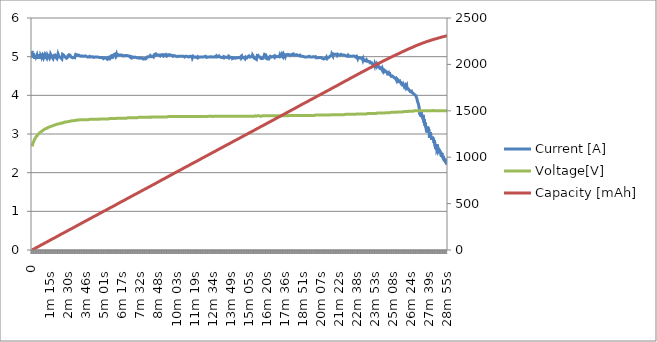
| Category | Current [A] | Voltage[V] |
|---|---|---|
| 0 | 5.15 | 2.68 |
|  1s  | 5.02 | 2.71 |
|  2s  | 5 | 2.75 |
|  4s  | 5.03 | 2.78 |
|  5s  | 5.04 | 2.8 |
|  7s  | 4.97 | 2.82 |
|  8s  | 5.02 | 2.85 |
|  10s  | 4.95 | 2.86 |
|  11s  | 5.02 | 2.88 |
|  13s  | 4.97 | 2.9 |
|  14s  | 5.04 | 2.91 |
|  16s  | 5 | 2.93 |
|  17s  | 4.98 | 2.94 |
|  19s  | 5.04 | 2.95 |
|  20s  | 4.98 | 2.96 |
|  22s  | 4.94 | 2.97 |
|  23s  | 5.05 | 2.99 |
|  25s  | 5.01 | 2.99 |
|  26s  | 4.98 | 3 |
|  28s  | 4.98 | 3.01 |
|  29s  | 5.06 | 3.02 |
|  31s  | 5.02 | 3.03 |
|  32s  | 4.98 | 3.04 |
|  34s  | 4.95 | 3.04 |
|  35s  | 5.04 | 3.05 |
|  36s  | 5.03 | 3.06 |
|  38s  | 5.01 | 3.07 |
|  39s  | 4.98 | 3.07 |
|  41s  | 4.97 | 3.08 |
|  42s  | 4.98 | 3.09 |
|  44s  | 5.05 | 3.09 |
|  45s  | 5.04 | 3.1 |
|  47s  | 5.02 | 3.1 |
|  48s  | 4.98 | 3.11 |
|  50s  | 4.97 | 3.11 |
|  51s  | 4.97 | 3.12 |
|  53s  | 5.05 | 3.13 |
|  54s  | 5.04 | 3.13 |
|  56s  | 5 | 3.14 |
|  57s  | 5.01 | 3.14 |
|  59s  | 4.98 | 3.14 |
|  1m 00s  | 4.96 | 3.15 |
|  1m 02s  | 4.94 | 3.15 |
|  1m 03s  | 5.05 | 3.16 |
|  1m 05s  | 5.05 | 3.16 |
|  1m 06s  | 5.02 | 3.17 |
|  1m 08s  | 5.01 | 3.17 |
|  1m 09s  | 4.99 | 3.17 |
|  1m 11s  | 4.97 | 3.18 |
|  1m 12s  | 4.96 | 3.18 |
|  1m 13s  | 4.94 | 3.19 |
|  1m 15s  | 5.01 | 3.19 |
|  1m 16s  | 5.06 | 3.19 |
|  1m 18s  | 5.04 | 3.2 |
|  1m 19s  | 5.02 | 3.2 |
|  1m 21s  | 5.02 | 3.2 |
|  1m 22s  | 4.99 | 3.21 |
|  1m 24s  | 4.98 | 3.21 |
|  1m 25s  | 4.97 | 3.21 |
|  1m 27s  | 4.95 | 3.22 |
|  1m 28s  | 4.93 | 3.22 |
|  1m 30s  | 5.03 | 3.23 |
|  1m 31s  | 5.05 | 3.23 |
|  1m 33s  | 5.04 | 3.23 |
|  1m 34s  | 5.04 | 3.23 |
|  1m 36s  | 5.01 | 3.24 |
|  1m 37s  | 5.01 | 3.24 |
|  1m 39s  | 4.98 | 3.24 |
|  1m 40s  | 4.97 | 3.24 |
|  1m 42s  | 4.97 | 3.25 |
|  1m 43s  | 4.95 | 3.25 |
|  1m 45s  | 4.93 | 3.25 |
|  1m 46s  | 5.03 | 3.26 |
|  1m 47s  | 5.07 | 3.26 |
|  1m 49s  | 5.05 | 3.26 |
|  1m 50s  | 5.02 | 3.26 |
|  1m 52s  | 5.03 | 3.26 |
|  1m 53s  | 5.02 | 3.27 |
|  1m 55s  | 4.99 | 3.27 |
|  1m 56s  | 5 | 3.27 |
|  1m 58s  | 4.98 | 3.27 |
|  1m 59s  | 4.97 | 3.28 |
|  2m 01s  | 4.96 | 3.28 |
|  2m 02s  | 4.96 | 3.28 |
|  2m 04s  | 4.94 | 3.28 |
|  2m 05s  | 4.99 | 3.29 |
|  2m 07s  | 5.06 | 3.29 |
|  2m 08s  | 5.04 | 3.29 |
|  2m 10s  | 5.04 | 3.29 |
|  2m 11s  | 5.04 | 3.3 |
|  2m 13s  | 5.03 | 3.3 |
|  2m 14s  | 5.01 | 3.3 |
|  2m 16s  | 5.01 | 3.3 |
|  2m 17s  | 5.01 | 3.31 |
|  2m 19s  | 4.99 | 3.31 |
|  2m 20s  | 4.97 | 3.31 |
|  2m 22s  | 4.99 | 3.31 |
|  2m 23s  | 4.96 | 3.31 |
|  2m 24s  | 4.95 | 3.31 |
|  2m 26s  | 4.95 | 3.32 |
|  2m 27s  | 4.98 | 3.32 |
|  2m 29s  | 5.02 | 3.32 |
|  2m 30s  | 5.04 | 3.32 |
|  2m 32s  | 5.04 | 3.32 |
|  2m 33s  | 5.05 | 3.33 |
|  2m 35s  | 5.05 | 3.33 |
|  2m 36s  | 5.03 | 3.33 |
|  2m 38s  | 5.04 | 3.33 |
|  2m 39s  | 5.02 | 3.33 |
|  2m 41s  | 5 | 3.33 |
|  2m 42s  | 5.01 | 3.34 |
|  2m 44s  | 5 | 3.34 |
|  2m 45s  | 4.98 | 3.34 |
|  2m 47s  | 4.98 | 3.34 |
|  2m 48s  | 4.99 | 3.34 |
|  2m 50s  | 4.97 | 3.34 |
|  2m 51s  | 4.96 | 3.34 |
|  2m 53s  | 4.95 | 3.34 |
|  2m 54s  | 4.98 | 3.35 |
|  2m 55s  | 4.94 | 3.35 |
|  2m 57s  | 4.97 | 3.35 |
|  2m 59s  | 4.99 | 3.35 |
|  3m 00s  | 4.99 | 3.35 |
|  3m 01s  | 5.06 | 3.35 |
|  3m 03s  | 5.05 | 3.36 |
|  3m 04s  | 5.05 | 3.36 |
|  3m 06s  | 5.05 | 3.36 |
|  3m 07s  | 5.05 | 3.36 |
|  3m 09s  | 5.06 | 3.36 |
|  3m 10s  | 5.03 | 3.36 |
|  3m 12s  | 5.04 | 3.36 |
|  3m 13s  | 5.04 | 3.36 |
|  3m 15s  | 5.04 | 3.36 |
|  3m 16s  | 5.04 | 3.36 |
|  3m 18s  | 5.04 | 3.37 |
|  3m 19s  | 5.02 | 3.37 |
|  3m 21s  | 5.03 | 3.37 |
|  3m 22s  | 5.03 | 3.37 |
|  3m 24s  | 5.01 | 3.37 |
|  3m 25s  | 5.02 | 3.37 |
|  3m 27s  | 5.03 | 3.37 |
|  3m 28s  | 5.02 | 3.37 |
|  3m 30s  | 5.03 | 3.37 |
|  3m 31s  | 5.02 | 3.37 |
|  3m 33s  | 5.01 | 3.37 |
|  3m 34s  | 5 | 3.37 |
|  3m 35s  | 5 | 3.37 |
|  3m 37s  | 5.01 | 3.37 |
|  3m 38s  | 5 | 3.37 |
|  3m 40s  | 5.02 | 3.37 |
|  3m 41s  | 5.02 | 3.37 |
|  3m 43s  | 5 | 3.37 |
|  3m 44s  | 5.02 | 3.37 |
|  3m 46s  | 5.01 | 3.37 |
|  3m 47s  | 5 | 3.37 |
|  3m 49s  | 4.99 | 3.37 |
|  3m 50s  | 4.99 | 3.37 |
|  3m 52s  | 4.99 | 3.37 |
|  3m 53s  | 4.99 | 3.38 |
|  3m 55s  | 4.99 | 3.37 |
|  3m 56s  | 4.99 | 3.38 |
|  3m 58s  | 5 | 3.38 |
|  3m 59s  | 5.01 | 3.38 |
|  4m 01s  | 5.01 | 3.38 |
|  4m 02s  | 5 | 3.38 |
|  4m 04s  | 4.99 | 3.38 |
|  4m 05s  | 4.99 | 3.38 |
|  4m 07s  | 4.99 | 3.38 |
|  4m 08s  | 5 | 3.38 |
|  4m 10s  | 5 | 3.38 |
|  4m 11s  | 5 | 3.38 |
|  4m 12s  | 5 | 3.38 |
|  4m 14s  | 4.99 | 3.38 |
|  4m 15s  | 5 | 3.38 |
|  4m 17s  | 4.98 | 3.38 |
|  4m 18s  | 4.98 | 3.38 |
|  4m 20s  | 4.99 | 3.38 |
|  4m 21s  | 4.99 | 3.38 |
|  4m 23s  | 4.99 | 3.38 |
|  4m 24s  | 4.98 | 3.38 |
|  4m 26s  | 4.99 | 3.38 |
|  4m 27s  | 4.99 | 3.38 |
|  4m 29s  | 4.98 | 3.38 |
|  4m 30s  | 4.99 | 3.38 |
|  4m 32s  | 5 | 3.38 |
|  4m 33s  | 5 | 3.38 |
|  4m 35s  | 4.99 | 3.38 |
|  4m 36s  | 4.98 | 3.38 |
|  4m 38s  | 4.99 | 3.38 |
|  4m 39s  | 4.98 | 3.38 |
|  4m 41s  | 4.98 | 3.39 |
|  4m 42s  | 4.98 | 3.39 |
|  4m 44s  | 4.98 | 3.39 |
|  4m 45s  | 4.97 | 3.39 |
|  4m 47s  | 4.97 | 3.39 |
|  4m 48s  | 4.98 | 3.39 |
|  4m 49s  | 4.98 | 3.39 |
|  4m 51s  | 4.96 | 3.39 |
|  4m 52s  | 4.98 | 3.39 |
|  4m 54s  | 4.98 | 3.39 |
|  4m 55s  | 4.98 | 3.39 |
|  4m 57s  | 4.95 | 3.39 |
|  4m 58s  | 4.97 | 3.39 |
|  5m 00s  | 4.96 | 3.39 |
|  5m 01s  | 4.97 | 3.39 |
|  5m 03s  | 4.96 | 3.39 |
|  5m 04s  | 4.96 | 3.39 |
|  5m 06s  | 4.97 | 3.39 |
|  5m 07s  | 4.96 | 3.39 |
|  5m 09s  | 4.97 | 3.39 |
|  5m 10s  | 4.95 | 3.39 |
|  5m 12s  | 4.97 | 3.39 |
|  5m 13s  | 4.96 | 3.39 |
|  5m 15s  | 4.97 | 3.39 |
|  5m 16s  | 4.94 | 3.39 |
|  5m 18s  | 4.96 | 3.39 |
|  5m 19s  | 4.94 | 3.39 |
|  5m 21s  | 4.96 | 3.39 |
|  5m 22s  | 4.94 | 3.4 |
|  5m 23s  | 4.95 | 3.4 |
|  5m 25s  | 4.99 | 3.4 |
|  5m 26s  | 4.96 | 3.4 |
|  5m 28s  | 4.98 | 3.4 |
|  5m 29s  | 4.95 | 3.4 |
|  5m 31s  | 4.99 | 3.4 |
|  5m 32s  | 4.95 | 3.4 |
|  5m 34s  | 4.99 | 3.4 |
|  5m 35s  | 5.01 | 3.4 |
|  5m 37s  | 5.06 | 3.4 |
|  5m 38s  | 5.02 | 3.4 |
|  5m 40s  | 5.01 | 3.4 |
|  5m 41s  | 5.04 | 3.4 |
|  5m 43s  | 5.06 | 3.4 |
|  5m 44s  | 5.07 | 3.4 |
|  5m 46s  | 5.06 | 3.4 |
|  5m 47s  | 5.07 | 3.4 |
|  5m 49s  | 5.03 | 3.4 |
|  5m 50s  | 5.05 | 3.4 |
|  5m 52s  | 5.07 | 3.41 |
|  5m 53s  | 5.03 | 3.4 |
|  5m 55s  | 5.05 | 3.41 |
|  5m 56s  | 5.06 | 3.41 |
|  5m 58s  | 5.06 | 3.41 |
|  5m 59s  | 5.05 | 3.41 |
|  6m 00s  | 5.04 | 3.41 |
|  6m 02s  | 5.05 | 3.41 |
|  6m 03s  | 5.05 | 3.41 |
|  6m 05s  | 5.04 | 3.41 |
|  6m 06s  | 5.04 | 3.41 |
|  6m 08s  | 5.04 | 3.41 |
|  6m 09s  | 5.04 | 3.41 |
|  6m 11s  | 5.03 | 3.41 |
|  6m 12s  | 5.03 | 3.41 |
|  6m 14s  | 5.04 | 3.41 |
|  6m 15s  | 5.05 | 3.41 |
|  6m 17s  | 5.04 | 3.41 |
|  6m 18s  | 5.02 | 3.41 |
|  6m 20s  | 5.03 | 3.41 |
|  6m 21s  | 5.02 | 3.41 |
|  6m 23s  | 5.03 | 3.41 |
|  6m 24s  | 5.03 | 3.41 |
|  6m 26s  | 5.03 | 3.41 |
|  6m 27s  | 5.02 | 3.41 |
|  6m 29s  | 5.02 | 3.41 |
|  6m 30s  | 5.01 | 3.41 |
|  6m 32s  | 5.03 | 3.41 |
|  6m 33s  | 5.04 | 3.41 |
|  6m 34s  | 5.02 | 3.41 |
|  6m 36s  | 5.03 | 3.42 |
|  6m 37s  | 5.01 | 3.42 |
|  6m 39s  | 5.01 | 3.42 |
|  6m 40s  | 5.02 | 3.42 |
|  6m 42s  | 5.03 | 3.42 |
|  6m 43s  | 5.01 | 3.42 |
|  6m 45s  | 5.02 | 3.42 |
|  6m 46s  | 5.01 | 3.42 |
|  6m 48s  | 5 | 3.42 |
|  6m 49s  | 4.99 | 3.42 |
|  6m 51s  | 4.99 | 3.42 |
|  6m 52s  | 4.99 | 3.42 |
|  6m 54s  | 4.97 | 3.42 |
|  6m 55s  | 5 | 3.42 |
|  6m 57s  | 4.99 | 3.42 |
|  6m 58s  | 4.99 | 3.42 |
|  7m 00s  | 4.99 | 3.42 |
|  7m 01s  | 4.98 | 3.42 |
|  7m 03s  | 5 | 3.42 |
|  7m 04s  | 4.98 | 3.42 |
|  7m 06s  | 4.98 | 3.42 |
|  7m 07s  | 4.99 | 3.42 |
|  7m 08s  | 4.99 | 3.42 |
|  7m 10s  | 4.98 | 3.42 |
|  7m 11s  | 4.98 | 3.42 |
|  7m 13s  | 4.98 | 3.42 |
|  7m 14s  | 4.99 | 3.42 |
|  7m 16s  | 4.97 | 3.42 |
|  7m 17s  | 4.97 | 3.42 |
|  7m 19s  | 4.96 | 3.42 |
|  7m 20s  | 4.97 | 3.42 |
|  7m 22s  | 4.97 | 3.42 |
|  7m 23s  | 4.98 | 3.43 |
|  7m 25s  | 4.97 | 3.42 |
|  7m 26s  | 4.96 | 3.43 |
|  7m 28s  | 4.96 | 3.43 |
|  7m 29s  | 4.96 | 3.43 |
|  7m 31s  | 4.97 | 3.43 |
|  7m 32s  | 4.95 | 3.43 |
|  7m 34s  | 4.97 | 3.43 |
|  7m 35s  | 4.96 | 3.43 |
|  7m 37s  | 4.97 | 3.43 |
|  7m 38s  | 4.97 | 3.43 |
|  7m 40s  | 4.96 | 3.43 |
|  7m 41s  | 4.96 | 3.43 |
|  7m 43s  | 4.97 | 3.43 |
|  7m 44s  | 4.94 | 3.43 |
|  7m 46s  | 4.94 | 3.43 |
|  7m 47s  | 4.95 | 3.43 |
|  7m 48s  | 4.95 | 3.43 |
|  7m 50s  | 4.96 | 3.43 |
|  7m 51s  | 4.93 | 3.43 |
|  7m 53s  | 4.94 | 3.43 |
|  7m 54s  | 4.94 | 3.43 |
|  7m 56s  | 4.96 | 3.43 |
|  7m 57s  | 4.96 | 3.43 |
|  7m 59s  | 4.95 | 3.43 |
|  8m 00s  | 4.99 | 3.43 |
|  8m 02s  | 5 | 3.43 |
|  8m 03s  | 5.01 | 3.43 |
|  8m 05s  | 5 | 3.43 |
|  8m 06s  | 5.01 | 3.43 |
|  8m 08s  | 5 | 3.43 |
|  8m 09s  | 5 | 3.43 |
|  8m 11s  | 5 | 3.43 |
|  8m 12s  | 4.99 | 3.44 |
|  8m 14s  | 5.03 | 3.43 |
|  8m 15s  | 5.02 | 3.43 |
|  8m 17s  | 5.02 | 3.43 |
|  8m 18s  | 5 | 3.44 |
|  8m 20s  | 5.01 | 3.44 |
|  8m 21s  | 5 | 3.44 |
|  8m 22s  | 5.01 | 3.44 |
|  8m 24s  | 5 | 3.44 |
|  8m 25s  | 5.01 | 3.44 |
|  8m 27s  | 4.99 | 3.44 |
|  8m 28s  | 5.01 | 3.44 |
|  8m 30s  | 5.03 | 3.44 |
|  8m 31s  | 5.06 | 3.44 |
|  8m 33s  | 5.04 | 3.44 |
|  8m 34s  | 5.06 | 3.44 |
|  8m 36s  | 5.07 | 3.44 |
|  8m 37s  | 5.04 | 3.44 |
|  8m 39s  | 5.05 | 3.44 |
|  8m 40s  | 5.04 | 3.44 |
|  8m 42s  | 5.05 | 3.44 |
|  8m 43s  | 5.06 | 3.44 |
|  8m 45s  | 5.06 | 3.44 |
|  8m 46s  | 5.04 | 3.44 |
|  8m 48s  | 5.05 | 3.44 |
|  8m 49s  | 5.05 | 3.44 |
|  8m 51s  | 5.04 | 3.44 |
|  8m 52s  | 5.05 | 3.44 |
|  8m 54s  | 5.05 | 3.44 |
|  8m 55s  | 5.02 | 3.44 |
|  8m 57s  | 5.04 | 3.44 |
|  8m 58s  | 5.03 | 3.44 |
|  8m 59s  | 5.05 | 3.44 |
|  9m 01s  | 5.04 | 3.44 |
|  9m 02s  | 5.05 | 3.44 |
|  9m 04s  | 5.05 | 3.44 |
|  9m 05s  | 5.03 | 3.44 |
|  9m 07s  | 5.04 | 3.44 |
|  9m 08s  | 5.02 | 3.44 |
|  9m 10s  | 5.03 | 3.44 |
|  9m 11s  | 5.05 | 3.44 |
|  9m 13s  | 5.05 | 3.44 |
|  9m 14s  | 5.04 | 3.44 |
|  9m 16s  | 5.04 | 3.44 |
|  9m 17s  | 5.05 | 3.44 |
|  9m 19s  | 5.05 | 3.44 |
|  9m 20s  | 5.02 | 3.44 |
|  9m 22s  | 5.05 | 3.45 |
|  9m 23s  | 5.03 | 3.44 |
|  9m 25s  | 5.04 | 3.44 |
|  9m 26s  | 5.03 | 3.45 |
|  9m 28s  | 5.04 | 3.45 |
|  9m 29s  | 5.03 | 3.45 |
|  9m 31s  | 5.05 | 3.45 |
|  9m 32s  | 5.04 | 3.45 |
|  9m 34s  | 5.05 | 3.45 |
|  9m 35s  | 5.05 | 3.45 |
|  9m 36s  | 5.05 | 3.45 |
|  9m 38s  | 5.04 | 3.45 |
|  9m 39s  | 5.04 | 3.45 |
|  9m 41s  | 5.03 | 3.45 |
|  9m 42s  | 5.02 | 3.45 |
|  9m 44s  | 5.03 | 3.45 |
|  9m 45s  | 5.02 | 3.45 |
|  9m 47s  | 5.03 | 3.45 |
|  9m 48s  | 5.01 | 3.45 |
|  9m 50s  | 5.02 | 3.45 |
|  9m 51s  | 5.02 | 3.45 |
|  9m 53s  | 5.03 | 3.45 |
|  9m 54s  | 5.02 | 3.45 |
|  9m 56s  | 5.01 | 3.45 |
|  9m 57s  | 5.02 | 3.45 |
|  9m 59s  | 5 | 3.45 |
|  10m 00s  | 5 | 3.45 |
|  10m 02s  | 5.01 | 3.45 |
|  10m 03s  | 5.01 | 3.45 |
|  10m 05s  | 5.02 | 3.45 |
|  10m 06s  | 5 | 3.45 |
|  10m 08s  | 4.99 | 3.45 |
|  10m 09s  | 5 | 3.45 |
|  10m 10s  | 5.01 | 3.45 |
|  10m 12s  | 5 | 3.45 |
|  10m 13s  | 5 | 3.45 |
|  10m 15s  | 5.01 | 3.45 |
|  10m 16s  | 5.02 | 3.45 |
|  10m 18s  | 5 | 3.45 |
|  10m 19s  | 5.01 | 3.45 |
|  10m 21s  | 5.01 | 3.45 |
|  10m 22s  | 4.99 | 3.45 |
|  10m 24s  | 5.01 | 3.45 |
|  10m 25s  | 5.01 | 3.45 |
|  10m 27s  | 5.02 | 3.45 |
|  10m 28s  | 5.01 | 3.45 |
|  10m 30s  | 5 | 3.45 |
|  10m 31s  | 5.01 | 3.45 |
|  10m 33s  | 5.01 | 3.45 |
|  10m 34s  | 5 | 3.45 |
|  10m 36s  | 5.01 | 3.45 |
|  10m 37s  | 4.99 | 3.45 |
|  10m 39s  | 4.99 | 3.45 |
|  10m 40s  | 5.01 | 3.45 |
|  10m 42s  | 5.01 | 3.45 |
|  10m 43s  | 5.01 | 3.45 |
|  10m 45s  | 5.01 | 3.45 |
|  10m 46s  | 5.01 | 3.45 |
|  10m 47s  | 4.99 | 3.45 |
|  10m 49s  | 5 | 3.45 |
|  10m 50s  | 5 | 3.45 |
|  10m 52s  | 4.99 | 3.45 |
|  10m 53s  | 5 | 3.45 |
|  10m 55s  | 4.99 | 3.45 |
|  10m 56s  | 5.01 | 3.45 |
|  10m 58s  | 5 | 3.45 |
|  10m 59s  | 5.01 | 3.45 |
|  11m 01s  | 5 | 3.45 |
|  11m 02s  | 5 | 3.45 |
|  11m 04s  | 5 | 3.45 |
|  11m 05s  | 5.01 | 3.45 |
|  11m 07s  | 5.02 | 3.45 |
|  11m 08s  | 5.01 | 3.45 |
|  11m 10s  | 4.97 | 3.45 |
|  11m 11s  | 4.98 | 3.45 |
|  11m 13s  | 5.01 | 3.45 |
|  11m 14s  | 5 | 3.45 |
|  11m 16s  | 5 | 3.45 |
|  11m 17s  | 4.99 | 3.45 |
|  11m 19s  | 4.99 | 3.45 |
|  11m 20s  | 5 | 3.45 |
|  11m 22s  | 4.99 | 3.45 |
|  11m 23s  | 4.99 | 3.45 |
|  11m 24s  | 4.97 | 3.45 |
|  11m 26s  | 4.98 | 3.45 |
|  11m 27s  | 4.99 | 3.45 |
|  11m 29s  | 4.99 | 3.45 |
|  11m 30s  | 5 | 3.45 |
|  11m 32s  | 4.98 | 3.45 |
|  11m 33s  | 4.97 | 3.45 |
|  11m 35s  | 4.99 | 3.45 |
|  11m 36s  | 4.99 | 3.45 |
|  11m 38s  | 4.99 | 3.45 |
|  11m 39s  | 4.99 | 3.45 |
|  11m 41s  | 4.98 | 3.45 |
|  11m 42s  | 4.99 | 3.45 |
|  11m 44s  | 5 | 3.45 |
|  11m 45s  | 4.98 | 3.45 |
|  11m 47s  | 4.99 | 3.45 |
|  11m 48s  | 4.98 | 3.45 |
|  11m 50s  | 4.99 | 3.45 |
|  11m 51s  | 4.99 | 3.45 |
|  11m 52s  | 4.99 | 3.45 |
|  11m 54s  | 4.99 | 3.45 |
|  11m 55s  | 4.99 | 3.45 |
|  11m 57s  | 4.98 | 3.45 |
|  11m 58s  | 4.98 | 3.45 |
|  12m 00s  | 5 | 3.45 |
|  12m 01s  | 4.99 | 3.45 |
|  12m 03s  | 5 | 3.45 |
|  12m 04s  | 5.01 | 3.45 |
|  12m 06s  | 5.01 | 3.45 |
|  12m 07s  | 5 | 3.45 |
|  12m 09s  | 4.98 | 3.45 |
|  12m 10s  | 5 | 3.45 |
|  12m 12s  | 4.99 | 3.45 |
|  12m 13s  | 4.99 | 3.46 |
|  12m 15s  | 4.99 | 3.45 |
|  12m 16s  | 5 | 3.46 |
|  12m 18s  | 4.99 | 3.45 |
|  12m 19s  | 5.01 | 3.45 |
|  12m 21s  | 5 | 3.46 |
|  12m 22s  | 4.99 | 3.45 |
|  12m 24s  | 5 | 3.45 |
|  12m 25s  | 5 | 3.46 |
|  12m 27s  | 5 | 3.45 |
|  12m 28s  | 5.01 | 3.46 |
|  12m 30s  | 4.99 | 3.46 |
|  12m 31s  | 4.99 | 3.46 |
|  12m 33s  | 4.98 | 3.46 |
|  12m 34s  | 4.99 | 3.45 |
|  12m 35s  | 4.99 | 3.46 |
|  12m 37s  | 5 | 3.46 |
|  12m 38s  | 4.99 | 3.46 |
|  12m 40s  | 4.99 | 3.46 |
|  12m 41s  | 4.99 | 3.46 |
|  12m 43s  | 5 | 3.46 |
|  12m 44s  | 5 | 3.46 |
|  12m 46s  | 5.01 | 3.46 |
|  12m 47s  | 5.01 | 3.46 |
|  12m 49s  | 5.02 | 3.46 |
|  12m 50s  | 4.99 | 3.46 |
|  12m 52s  | 5 | 3.46 |
|  12m 53s  | 4.98 | 3.46 |
|  12m 55s  | 4.99 | 3.46 |
|  12m 56s  | 5.01 | 3.46 |
|  12m 58s  | 5 | 3.46 |
|  12m 59s  | 5.01 | 3.46 |
|  13m 01s  | 4.97 | 3.46 |
|  13m 02s  | 5 | 3.46 |
|  13m 04s  | 5 | 3.46 |
|  13m 05s  | 4.98 | 3.46 |
|  13m 06s  | 4.99 | 3.46 |
|  13m 08s  | 4.98 | 3.46 |
|  13m 10s  | 4.97 | 3.46 |
|  13m 11s  | 4.98 | 3.46 |
|  13m 12s  | 4.98 | 3.46 |
|  13m 14s  | 4.96 | 3.46 |
|  13m 15s  | 4.98 | 3.46 |
|  13m 17s  | 4.97 | 3.46 |
|  13m 18s  | 5 | 3.46 |
|  13m 20s  | 5 | 3.46 |
|  13m 21s  | 4.98 | 3.46 |
|  13m 23s  | 4.97 | 3.46 |
|  13m 24s  | 4.97 | 3.46 |
|  13m 26s  | 4.96 | 3.46 |
|  13m 27s  | 4.99 | 3.46 |
|  13m 29s  | 4.99 | 3.46 |
|  13m 30s  | 4.97 | 3.46 |
|  13m 32s  | 4.98 | 3.46 |
|  13m 33s  | 5 | 3.46 |
|  13m 35s  | 5 | 3.46 |
|  13m 36s  | 4.99 | 3.46 |
|  13m 38s  | 4.99 | 3.46 |
|  13m 39s  | 5.01 | 3.46 |
|  13m 41s  | 4.97 | 3.46 |
|  13m 42s  | 5.01 | 3.46 |
|  13m 44s  | 5 | 3.46 |
|  13m 45s  | 5.01 | 3.46 |
|  13m 46s  | 4.99 | 3.46 |
|  13m 48s  | 4.97 | 3.46 |
|  13m 49s  | 4.99 | 3.46 |
|  13m 51s  | 4.98 | 3.46 |
|  13m 52s  | 4.97 | 3.46 |
|  13m 54s  | 4.98 | 3.46 |
|  13m 55s  | 4.98 | 3.46 |
|  13m 57s  | 4.95 | 3.46 |
|  13m 58s  | 4.96 | 3.46 |
|  14m 00s  | 4.97 | 3.46 |
|  14m 01s  | 4.96 | 3.46 |
|  14m 03s  | 4.95 | 3.46 |
|  14m 04s  | 4.97 | 3.46 |
|  14m 06s  | 4.97 | 3.46 |
|  14m 07s  | 4.96 | 3.46 |
|  14m 09s  | 4.96 | 3.46 |
|  14m 10s  | 4.96 | 3.46 |
|  14m 12s  | 4.95 | 3.46 |
|  14m 13s  | 4.95 | 3.46 |
|  14m 15s  | 4.97 | 3.46 |
|  14m 16s  | 4.97 | 3.46 |
|  14m 18s  | 4.98 | 3.46 |
|  14m 19s  | 4.97 | 3.46 |
|  14m 21s  | 4.98 | 3.46 |
|  14m 22s  | 4.98 | 3.46 |
|  14m 23s  | 4.98 | 3.46 |
|  14m 25s  | 4.96 | 3.46 |
|  14m 26s  | 4.97 | 3.46 |
|  14m 28s  | 4.97 | 3.46 |
|  14m 29s  | 4.97 | 3.46 |
|  14m 31s  | 4.98 | 3.46 |
|  14m 32s  | 5 | 3.46 |
|  14m 34s  | 4.97 | 3.46 |
|  14m 35s  | 4.98 | 3.46 |
|  14m 37s  | 5 | 3.46 |
|  14m 38s  | 4.97 | 3.46 |
|  14m 40s  | 4.95 | 3.46 |
|  14m 41s  | 4.95 | 3.46 |
|  14m 43s  | 4.97 | 3.46 |
|  14m 44s  | 4.97 | 3.46 |
|  14m 46s  | 4.99 | 3.46 |
|  14m 47s  | 4.98 | 3.46 |
|  14m 49s  | 4.96 | 3.46 |
|  14m 50s  | 4.95 | 3.46 |
|  14m 52s  | 4.96 | 3.46 |
|  14m 53s  | 4.99 | 3.46 |
|  14m 55s  | 4.99 | 3.46 |
|  14m 56s  | 4.98 | 3.46 |
|  14m 57s  | 4.97 | 3.46 |
|  14m 59s  | 4.98 | 3.46 |
|  15m 00s  | 4.96 | 3.46 |
|  15m 02s  | 5 | 3.46 |
|  15m 03s  | 5 | 3.46 |
|  15m 05s  | 5 | 3.46 |
|  15m 06s  | 5.02 | 3.46 |
|  15m 08s  | 5 | 3.46 |
|  15m 09s  | 5 | 3.46 |
|  15m 11s  | 4.99 | 3.46 |
|  15m 12s  | 5.01 | 3.46 |
|  15m 14s  | 4.99 | 3.46 |
|  15m 15s  | 5 | 3.46 |
|  15m 17s  | 5.01 | 3.46 |
|  15m 18s  | 5 | 3.46 |
|  15m 20s  | 5 | 3.46 |
|  15m 21s  | 5.04 | 3.46 |
|  15m 23s  | 5.02 | 3.46 |
|  15m 24s  | 5.01 | 3.46 |
|  15m 26s  | 5.02 | 3.46 |
|  15m 27s  | 4.99 | 3.46 |
|  15m 29s  | 4.96 | 3.46 |
|  15m 30s  | 4.97 | 3.46 |
|  15m 32s  | 4.95 | 3.47 |
|  15m 33s  | 4.95 | 3.46 |
|  15m 34s  | 4.94 | 3.46 |
|  15m 36s  | 4.93 | 3.46 |
|  15m 37s  | 4.93 | 3.46 |
|  15m 39s  | 4.95 | 3.46 |
|  15m 40s  | 5.01 | 3.47 |
|  15m 42s  | 5.07 | 3.46 |
|  15m 43s  | 5.02 | 3.46 |
|  15m 45s  | 5.01 | 3.47 |
|  15m 46s  | 5 | 3.47 |
|  15m 48s  | 5 | 3.47 |
|  15m 49s  | 5.01 | 3.47 |
|  15m 51s  | 5 | 3.47 |
|  15m 52s  | 4.99 | 3.47 |
|  15m 54s  | 4.97 | 3.46 |
|  15m 55s  | 4.97 | 3.46 |
|  15m 57s  | 4.95 | 3.47 |
|  15m 58s  | 4.97 | 3.46 |
|  16m 00s  | 4.95 | 3.47 |
|  16m 01s  | 4.95 | 3.47 |
|  16m 03s  | 4.95 | 3.47 |
|  16m 04s  | 4.96 | 3.47 |
|  16m 06s  | 4.96 | 3.47 |
|  16m 07s  | 5.02 | 3.47 |
|  16m 09s  | 4.96 | 3.47 |
|  16m 10s  | 4.94 | 3.47 |
|  16m 11s  | 5.06 | 3.47 |
|  16m 13s  | 5.06 | 3.47 |
|  16m 14s  | 5.04 | 3.47 |
|  16m 16s  | 5.05 | 3.47 |
|  16m 17s  | 5.04 | 3.47 |
|  16m 19s  | 5.01 | 3.46 |
|  16m 20s  | 4.95 | 3.47 |
|  16m 22s  | 4.95 | 3.47 |
|  16m 23s  | 4.94 | 3.47 |
|  16m 25s  | 4.94 | 3.47 |
|  16m 26s  | 4.94 | 3.47 |
|  16m 28s  | 4.93 | 3.47 |
|  16m 29s  | 4.94 | 3.47 |
|  16m 31s  | 4.98 | 3.47 |
|  16m 32s  | 5 | 3.47 |
|  16m 34s  | 5 | 3.47 |
|  16m 35s  | 5.01 | 3.47 |
|  16m 37s  | 5.01 | 3.47 |
|  16m 38s  | 5.01 | 3.47 |
|  16m 40s  | 4.99 | 3.47 |
|  16m 41s  | 5 | 3.47 |
|  16m 43s  | 5 | 3.47 |
|  16m 44s  | 5 | 3.47 |
|  16m 45s  | 4.99 | 3.47 |
|  16m 47s  | 5.01 | 3.47 |
|  16m 48s  | 5.01 | 3.47 |
|  16m 50s  | 4.99 | 3.47 |
|  16m 51s  | 5 | 3.47 |
|  16m 53s  | 4.98 | 3.47 |
|  16m 54s  | 5 | 3.47 |
|  16m 56s  | 5.02 | 3.47 |
|  16m 57s  | 5.01 | 3.47 |
|  16m 59s  | 5.02 | 3.47 |
|  17m 00s  | 5 | 3.47 |
|  17m 02s  | 5 | 3.47 |
|  17m 03s  | 4.99 | 3.47 |
|  17m 05s  | 5 | 3.47 |
|  17m 06s  | 4.99 | 3.47 |
|  17m 08s  | 5 | 3.47 |
|  17m 09s  | 5.01 | 3.47 |
|  17m 11s  | 4.99 | 3.47 |
|  17m 12s  | 5 | 3.47 |
|  17m 14s  | 5 | 3.47 |
|  17m 15s  | 5.03 | 3.47 |
|  17m 17s  | 5 | 3.47 |
|  17m 18s  | 5 | 3.47 |
|  17m 20s  | 5 | 3.47 |
|  17m 21s  | 5.01 | 3.47 |
|  17m 22s  | 4.99 | 3.47 |
|  17m 24s  | 5.06 | 3.47 |
|  17m 25s  | 5.05 | 3.47 |
|  17m 27s  | 5.02 | 3.47 |
|  17m 28s  | 5.04 | 3.47 |
|  17m 30s  | 5.06 | 3.47 |
|  17m 31s  | 5.03 | 3.47 |
|  17m 33s  | 5.06 | 3.47 |
|  17m 34s  | 5.06 | 3.47 |
|  17m 36s  | 5.06 | 3.47 |
|  17m 37s  | 5.05 | 3.47 |
|  17m 39s  | 5.02 | 3.47 |
|  17m 40s  | 5.05 | 3.47 |
|  17m 42s  | 5.05 | 3.47 |
|  17m 43s  | 5.04 | 3.47 |
|  17m 45s  | 5.05 | 3.48 |
|  17m 46s  | 5.06 | 3.47 |
|  17m 48s  | 5.07 | 3.48 |
|  17m 49s  | 5.06 | 3.47 |
|  17m 51s  | 5.05 | 3.48 |
|  17m 52s  | 5.06 | 3.48 |
|  17m 53s  | 5.05 | 3.48 |
|  17m 55s  | 5.06 | 3.48 |
|  17m 56s  | 5.05 | 3.48 |
|  17m 58s  | 5.03 | 3.48 |
|  17m 59s  | 5.03 | 3.48 |
|  18m 01s  | 5.04 | 3.48 |
|  18m 02s  | 5.05 | 3.48 |
|  18m 04s  | 5.05 | 3.48 |
|  18m 05s  | 5.03 | 3.48 |
|  18m 07s  | 5.06 | 3.48 |
|  18m 08s  | 5.05 | 3.48 |
|  18m 10s  | 5.06 | 3.48 |
|  18m 11s  | 5.07 | 3.48 |
|  18m 13s  | 5.04 | 3.48 |
|  18m 14s  | 5.06 | 3.48 |
|  18m 16s  | 5.03 | 3.48 |
|  18m 17s  | 5.05 | 3.48 |
|  18m 19s  | 5.04 | 3.48 |
|  18m 20s  | 5.03 | 3.48 |
|  18m 22s  | 5.04 | 3.48 |
|  18m 23s  | 5.04 | 3.48 |
|  18m 25s  | 5.03 | 3.48 |
|  18m 26s  | 5.05 | 3.48 |
|  18m 28s  | 5.04 | 3.48 |
|  18m 29s  | 5.04 | 3.48 |
|  18m 31s  | 5.03 | 3.48 |
|  18m 32s  | 5.05 | 3.48 |
|  18m 33s  | 5.02 | 3.48 |
|  18m 35s  | 5.03 | 3.48 |
|  18m 36s  | 5.03 | 3.48 |
|  18m 38s  | 5.03 | 3.48 |
|  18m 39s  | 5.04 | 3.48 |
|  18m 41s  | 5.04 | 3.48 |
|  18m 42s  | 5.01 | 3.48 |
|  18m 44s  | 5 | 3.48 |
|  18m 45s  | 5.01 | 3.48 |
|  18m 47s  | 5.01 | 3.48 |
|  18m 48s  | 5.03 | 3.48 |
|  18m 50s  | 5 | 3.48 |
|  18m 51s  | 5.01 | 3.48 |
|  18m 53s  | 4.99 | 3.48 |
|  18m 54s  | 5 | 3.48 |
|  18m 56s  | 5 | 3.48 |
|  18m 57s  | 5.02 | 3.48 |
|  18m 59s  | 5.01 | 3.48 |
|  19m 00s  | 4.99 | 3.48 |
|  19m 02s  | 5 | 3.48 |
|  19m 03s  | 4.99 | 3.48 |
|  19m 05s  | 4.99 | 3.48 |
|  19m 06s  | 5.01 | 3.48 |
|  19m 08s  | 5 | 3.48 |
|  19m 09s  | 4.99 | 3.48 |
|  19m 10s  | 4.99 | 3.48 |
|  19m 12s  | 4.99 | 3.48 |
|  19m 13s  | 5 | 3.48 |
|  19m 15s  | 5.02 | 3.48 |
|  19m 16s  | 4.99 | 3.48 |
|  19m 18s  | 5.01 | 3.48 |
|  19m 19s  | 4.99 | 3.48 |
|  19m 21s  | 5 | 3.48 |
|  19m 22s  | 4.99 | 3.48 |
|  19m 24s  | 5 | 3.48 |
|  19m 25s  | 5 | 3.48 |
|  19m 27s  | 4.99 | 3.48 |
|  19m 28s  | 4.99 | 3.48 |
|  19m 30s  | 5.01 | 3.48 |
|  19m 31s  | 4.99 | 3.48 |
|  19m 33s  | 4.99 | 3.48 |
|  19m 34s  | 4.99 | 3.49 |
|  19m 36s  | 5 | 3.48 |
|  19m 37s  | 5 | 3.48 |
|  19m 39s  | 4.99 | 3.48 |
|  19m 40s  | 4.99 | 3.48 |
|  19m 42s  | 4.99 | 3.49 |
|  19m 43s  | 4.97 | 3.49 |
|  19m 44s  | 5 | 3.49 |
|  19m 46s  | 4.98 | 3.49 |
|  19m 47s  | 4.97 | 3.49 |
|  19m 49s  | 4.98 | 3.49 |
|  19m 50s  | 4.98 | 3.49 |
|  19m 52s  | 4.97 | 3.49 |
|  19m 53s  | 4.99 | 3.49 |
|  19m 55s  | 4.99 | 3.49 |
|  19m 56s  | 4.97 | 3.49 |
|  19m 58s  | 4.97 | 3.49 |
|  19m 59s  | 4.97 | 3.49 |
|  20m 01s  | 4.98 | 3.49 |
|  20m 02s  | 5 | 3.49 |
|  20m 04s  | 4.97 | 3.49 |
|  20m 05s  | 4.98 | 3.49 |
|  20m 07s  | 5 | 3.49 |
|  20m 08s  | 4.96 | 3.49 |
|  20m 10s  | 4.97 | 3.49 |
|  20m 11s  | 4.97 | 3.49 |
|  20m 13s  | 4.96 | 3.49 |
|  20m 14s  | 4.95 | 3.49 |
|  20m 16s  | 4.96 | 3.49 |
|  20m 17s  | 4.93 | 3.49 |
|  20m 19s  | 4.94 | 3.49 |
|  20m 20s  | 4.96 | 3.49 |
|  20m 21s  | 4.95 | 3.49 |
|  20m 23s  | 4.95 | 3.49 |
|  20m 24s  | 4.96 | 3.49 |
|  20m 26s  | 4.95 | 3.49 |
|  20m 27s  | 4.96 | 3.49 |
|  20m 29s  | 4.97 | 3.49 |
|  20m 30s  | 4.99 | 3.49 |
|  20m 32s  | 5 | 3.49 |
|  20m 33s  | 4.95 | 3.49 |
|  20m 35s  | 4.93 | 3.49 |
|  20m 36s  | 4.95 | 3.49 |
|  20m 38s  | 4.98 | 3.49 |
|  20m 39s  | 5 | 3.49 |
|  20m 41s  | 5 | 3.49 |
|  20m 42s  | 4.99 | 3.49 |
|  20m 44s  | 5 | 3.49 |
|  20m 45s  | 5.01 | 3.49 |
|  20m 47s  | 5.02 | 3.49 |
|  20m 48s  | 5.03 | 3.5 |
|  20m 50s  | 5.04 | 3.49 |
|  20m 51s  | 5.03 | 3.5 |
|  20m 52s  | 5.07 | 3.49 |
|  20m 54s  | 5.06 | 3.5 |
|  20m 55s  | 5.06 | 3.5 |
|  20m 57s  | 5.02 | 3.5 |
|  20m 58s  | 5.07 | 3.5 |
|  21m 00s  | 5.05 | 3.5 |
|  21m 01s  | 5.05 | 3.5 |
|  21m 03s  | 5.06 | 3.5 |
|  21m 04s  | 5.05 | 3.5 |
|  21m 06s  | 5.06 | 3.5 |
|  21m 07s  | 5.06 | 3.5 |
|  21m 09s  | 5.06 | 3.5 |
|  21m 10s  | 5.05 | 3.5 |
|  21m 12s  | 5.06 | 3.5 |
|  21m 13s  | 5.05 | 3.5 |
|  21m 15s  | 5.03 | 3.5 |
|  21m 16s  | 5.05 | 3.5 |
|  21m 18s  | 5.06 | 3.5 |
|  21m 19s  | 5.06 | 3.5 |
|  21m 21s  | 5.05 | 3.5 |
|  21m 22s  | 5.04 | 3.5 |
|  21m 24s  | 5.05 | 3.5 |
|  21m 25s  | 5.06 | 3.5 |
|  21m 27s  | 5.04 | 3.5 |
|  21m 28s  | 5.05 | 3.5 |
|  21m 30s  | 5.05 | 3.5 |
|  21m 31s  | 5.06 | 3.5 |
|  21m 32s  | 5.05 | 3.5 |
|  21m 34s  | 5.05 | 3.5 |
|  21m 35s  | 5.04 | 3.5 |
|  21m 37s  | 5.05 | 3.5 |
|  21m 38s  | 5.06 | 3.5 |
|  21m 40s  | 5.04 | 3.5 |
|  21m 41s  | 5.04 | 3.5 |
|  21m 43s  | 5.04 | 3.5 |
|  21m 44s  | 5.04 | 3.5 |
|  21m 46s  | 5.03 | 3.51 |
|  21m 47s  | 5.04 | 3.51 |
|  21m 49s  | 5.03 | 3.51 |
|  21m 50s  | 5.03 | 3.51 |
|  21m 52s  | 5.02 | 3.51 |
|  21m 53s  | 5.02 | 3.51 |
|  21m 55s  | 5.03 | 3.51 |
|  21m 56s  | 5.03 | 3.51 |
|  21m 58s  | 5.01 | 3.51 |
|  21m 59s  | 5.03 | 3.51 |
|  22m 01s  | 5.04 | 3.51 |
|  22m 02s  | 5.03 | 3.51 |
|  22m 04s  | 5.04 | 3.51 |
|  22m 05s  | 5.01 | 3.51 |
|  22m 07s  | 5.03 | 3.51 |
|  22m 08s  | 5.02 | 3.51 |
|  22m 09s  | 5.01 | 3.51 |
|  22m 11s  | 5.02 | 3.51 |
|  22m 12s  | 5.01 | 3.51 |
|  22m 14s  | 5.01 | 3.51 |
|  22m 15s  | 5 | 3.51 |
|  22m 17s  | 5.02 | 3.51 |
|  22m 18s  | 5.01 | 3.51 |
|  22m 20s  | 5.02 | 3.51 |
|  22m 21s  | 5 | 3.51 |
|  22m 23s  | 5.02 | 3.51 |
|  22m 24s  | 5.02 | 3.51 |
|  22m 26s  | 5.03 | 3.51 |
|  22m 27s  | 5.01 | 3.51 |
|  22m 29s  | 5.01 | 3.51 |
|  22m 30s  | 4.99 | 3.51 |
|  22m 32s  | 4.99 | 3.51 |
|  22m 33s  | 4.98 | 3.51 |
|  22m 35s  | 4.98 | 3.51 |
|  22m 36s  | 5.01 | 3.51 |
|  22m 38s  | 4.99 | 3.52 |
|  22m 39s  | 5.01 | 3.51 |
|  22m 41s  | 4.95 | 3.52 |
|  22m 42s  | 4.98 | 3.52 |
|  22m 43s  | 4.96 | 3.52 |
|  22m 45s  | 4.99 | 3.52 |
|  22m 46s  | 4.98 | 3.52 |
|  22m 48s  | 4.99 | 3.52 |
|  22m 49s  | 4.99 | 3.52 |
|  22m 51s  | 4.96 | 3.52 |
|  22m 52s  | 4.94 | 3.52 |
|  22m 54s  | 4.96 | 3.52 |
|  22m 55s  | 4.96 | 3.52 |
|  22m 57s  | 4.97 | 3.52 |
|  22m 58s  | 4.95 | 3.52 |
|  23m 00s  | 4.97 | 3.52 |
|  23m 01s  | 4.97 | 3.52 |
|  23m 03s  | 4.91 | 3.52 |
|  23m 04s  | 4.94 | 3.52 |
|  23m 06s  | 4.91 | 3.52 |
|  23m 07s  | 4.93 | 3.52 |
|  23m 09s  | 4.92 | 3.52 |
|  23m 10s  | 4.9 | 3.52 |
|  23m 12s  | 4.92 | 3.52 |
|  23m 13s  | 4.9 | 3.52 |
|  23m 15s  | 4.89 | 3.52 |
|  23m 16s  | 4.91 | 3.52 |
|  23m 18s  | 4.92 | 3.52 |
|  23m 19s  | 4.9 | 3.53 |
|  23m 20s  | 4.92 | 3.53 |
|  23m 22s  | 4.88 | 3.53 |
|  23m 23s  | 4.88 | 3.53 |
|  23m 25s  | 4.88 | 3.53 |
|  23m 26s  | 4.88 | 3.53 |
|  23m 28s  | 4.87 | 3.53 |
|  23m 29s  | 4.86 | 3.53 |
|  23m 31s  | 4.87 | 3.53 |
|  23m 32s  | 4.84 | 3.53 |
|  23m 34s  | 4.81 | 3.53 |
|  23m 35s  | 4.85 | 3.53 |
|  23m 37s  | 4.86 | 3.53 |
|  23m 38s  | 4.84 | 3.53 |
|  23m 40s  | 4.84 | 3.53 |
|  23m 41s  | 4.81 | 3.53 |
|  23m 43s  | 4.83 | 3.53 |
|  23m 44s  | 4.81 | 3.53 |
|  23m 46s  | 4.8 | 3.53 |
|  23m 47s  | 4.76 | 3.53 |
|  23m 49s  | 4.82 | 3.53 |
|  23m 50s  | 4.82 | 3.53 |
|  23m 52s  | 4.77 | 3.53 |
|  23m 53s  | 4.82 | 3.53 |
|  23m 54s  | 4.8 | 3.53 |
|  23m 56s  | 4.78 | 3.53 |
|  23m 57s  | 4.79 | 3.53 |
|  23m 59s  | 4.81 | 3.53 |
|  24m 00s  | 4.79 | 3.54 |
|  24m 02s  | 4.74 | 3.54 |
|  24m 03s  | 4.75 | 3.54 |
|  24m 05s  | 4.74 | 3.54 |
|  24m 06s  | 4.77 | 3.54 |
|  24m 08s  | 4.74 | 3.54 |
|  24m 09s  | 4.75 | 3.54 |
|  24m 11s  | 4.72 | 3.54 |
|  24m 12s  | 4.73 | 3.54 |
|  24m 14s  | 4.7 | 3.54 |
|  24m 15s  | 4.7 | 3.54 |
|  24m 17s  | 4.72 | 3.54 |
|  24m 18s  | 4.71 | 3.54 |
|  24m 20s  | 4.69 | 3.54 |
|  24m 21s  | 4.69 | 3.54 |
|  24m 23s  | 4.66 | 3.54 |
|  24m 24s  | 4.69 | 3.54 |
|  24m 26s  | 4.7 | 3.54 |
|  24m 27s  | 4.64 | 3.54 |
|  24m 29s  | 4.67 | 3.54 |
|  24m 30s  | 4.68 | 3.54 |
|  24m 31s  | 4.65 | 3.55 |
|  24m 33s  | 4.65 | 3.54 |
|  24m 34s  | 4.61 | 3.55 |
|  24m 36s  | 4.63 | 3.55 |
|  24m 37s  | 4.63 | 3.55 |
|  24m 39s  | 4.62 | 3.55 |
|  24m 40s  | 4.62 | 3.55 |
|  24m 42s  | 4.61 | 3.55 |
|  24m 43s  | 4.6 | 3.55 |
|  24m 45s  | 4.57 | 3.55 |
|  24m 46s  | 4.56 | 3.55 |
|  24m 48s  | 4.57 | 3.55 |
|  24m 49s  | 4.59 | 3.55 |
|  24m 51s  | 4.55 | 3.55 |
|  24m 52s  | 4.55 | 3.55 |
|  24m 54s  | 4.56 | 3.55 |
|  24m 55s  | 4.56 | 3.55 |
|  24m 57s  | 4.53 | 3.55 |
|  24m 58s  | 4.52 | 3.56 |
|  25m 00s  | 4.54 | 3.56 |
|  25m 01s  | 4.49 | 3.55 |
|  25m 03s  | 4.49 | 3.56 |
|  25m 04s  | 4.48 | 3.56 |
|  25m 05s  | 4.5 | 3.56 |
|  25m 07s  | 4.48 | 3.56 |
|  25m 08s  | 4.49 | 3.56 |
|  25m 10s  | 4.48 | 3.56 |
|  25m 11s  | 4.46 | 3.56 |
|  25m 13s  | 4.49 | 3.56 |
|  25m 14s  | 4.45 | 3.56 |
|  25m 16s  | 4.43 | 3.56 |
|  25m 17s  | 4.44 | 3.56 |
|  25m 19s  | 4.45 | 3.56 |
|  25m 20s  | 4.46 | 3.56 |
|  25m 22s  | 4.43 | 3.56 |
|  25m 23s  | 4.39 | 3.56 |
|  25m 25s  | 4.43 | 3.56 |
|  25m 26s  | 4.41 | 3.57 |
|  25m 28s  | 4.41 | 3.56 |
|  25m 29s  | 4.4 | 3.57 |
|  25m 31s  | 4.4 | 3.57 |
|  25m 32s  | 4.36 | 3.57 |
|  25m 34s  | 4.38 | 3.57 |
|  25m 35s  | 4.35 | 3.57 |
|  25m 37s  | 4.37 | 3.57 |
|  25m 38s  | 4.33 | 3.57 |
|  25m 40s  | 4.36 | 3.57 |
|  25m 41s  | 4.32 | 3.57 |
|  25m 42s  | 4.34 | 3.57 |
|  25m 44s  | 4.32 | 3.57 |
|  25m 45s  | 4.28 | 3.57 |
|  25m 47s  | 4.3 | 3.57 |
|  25m 48s  | 4.29 | 3.57 |
|  25m 50s  | 4.31 | 3.57 |
|  25m 51s  | 4.29 | 3.58 |
|  25m 53s  | 4.27 | 3.58 |
|  25m 54s  | 4.28 | 3.58 |
|  25m 56s  | 4.22 | 3.58 |
|  25m 57s  | 4.23 | 3.58 |
|  25m 59s  | 4.23 | 3.58 |
|  26m 00s  | 4.26 | 3.58 |
|  26m 02s  | 4.26 | 3.58 |
|  26m 03s  | 4.2 | 3.58 |
|  26m 05s  | 4.22 | 3.58 |
|  26m 06s  | 4.24 | 3.58 |
|  26m 08s  | 4.17 | 3.58 |
|  26m 09s  | 4.17 | 3.58 |
|  26m 11s  | 4.16 | 3.58 |
|  26m 12s  | 4.17 | 3.58 |
|  26m 14s  | 4.16 | 3.59 |
|  26m 15s  | 4.16 | 3.59 |
|  26m 17s  | 4.13 | 3.59 |
|  26m 18s  | 4.12 | 3.59 |
|  26m 19s  | 4.12 | 3.59 |
|  26m 21s  | 4.1 | 3.59 |
|  26m 22s  | 4.11 | 3.59 |
|  26m 24s  | 4.08 | 3.59 |
|  26m 25s  | 4.11 | 3.59 |
|  26m 27s  | 4.08 | 3.59 |
|  26m 28s  | 4.08 | 3.59 |
|  26m 30s  | 4.08 | 3.59 |
|  26m 31s  | 4.06 | 3.59 |
|  26m 33s  | 4.04 | 3.59 |
|  26m 34s  | 4.05 | 3.59 |
|  26m 36s  | 4.03 | 3.6 |
|  26m 37s  | 4.03 | 3.6 |
|  26m 39s  | 4.01 | 3.6 |
|  26m 40s  | 4.01 | 3.6 |
|  26m 42s  | 4.01 | 3.6 |
|  26m 43s  | 4.02 | 3.6 |
|  26m 45s  | 3.99 | 3.6 |
|  26m 46s  | 3.95 | 3.6 |
|  26m 48s  | 3.94 | 3.6 |
|  26m 49s  | 3.9 | 3.6 |
|  26m 51s  | 3.85 | 3.6 |
|  26m 52s  | 3.85 | 3.6 |
|  26m 53s  | 3.85 | 3.6 |
|  26m 55s  | 3.77 | 3.6 |
|  26m 56s  | 3.75 | 3.6 |
|  26m 58s  | 3.68 | 3.6 |
|  26m 59s  | 3.67 | 3.6 |
|  27m 01s  | 3.5 | 3.6 |
|  27m 02s  | 3.57 | 3.6 |
|  27m 04s  | 3.53 | 3.6 |
|  27m 05s  | 3.45 | 3.6 |
|  27m 07s  | 3.57 | 3.6 |
|  27m 08s  | 3.55 | 3.6 |
|  27m 10s  | 3.45 | 3.6 |
|  27m 11s  | 3.47 | 3.6 |
|  27m 13s  | 3.41 | 3.6 |
|  27m 14s  | 3.49 | 3.6 |
|  27m 16s  | 3.44 | 3.6 |
|  27m 17s  | 3.43 | 3.6 |
|  27m 19s  | 3.29 | 3.6 |
|  27m 20s  | 3.38 | 3.6 |
|  27m 22s  | 3.22 | 3.6 |
|  27m 23s  | 3.29 | 3.6 |
|  27m 25s  | 3.31 | 3.6 |
|  27m 26s  | 3.17 | 3.6 |
|  27m 28s  | 3.11 | 3.6 |
|  27m 29s  | 3.1 | 3.6 |
|  27m 30s  | 3.04 | 3.6 |
|  27m 32s  | 3.13 | 3.6 |
|  27m 33s  | 3.19 | 3.6 |
|  27m 35s  | 3.06 | 3.6 |
|  27m 36s  | 3.16 | 3.6 |
|  27m 38s  | 3.15 | 3.6 |
|  27m 39s  | 3.07 | 3.6 |
|  27m 41s  | 2.9 | 3.6 |
|  27m 42s  | 2.96 | 3.6 |
|  27m 44s  | 2.92 | 3.6 |
|  27m 45s  | 3.05 | 3.6 |
|  27m 47s  | 2.95 | 3.6 |
|  27m 48s  | 2.91 | 3.6 |
|  27m 50s  | 2.9 | 3.6 |
|  27m 51s  | 2.85 | 3.6 |
|  27m 53s  | 2.93 | 3.6 |
|  27m 54s  | 2.86 | 3.6 |
|  27m 56s  | 2.9 | 3.6 |
|  27m 57s  | 2.91 | 3.61 |
|  27m 59s  | 2.84 | 3.6 |
|  28m 00s  | 2.77 | 3.6 |
|  28m 02s  | 2.84 | 3.6 |
|  28m 03s  | 2.85 | 3.6 |
|  28m 05s  | 2.69 | 3.6 |
|  28m 06s  | 2.66 | 3.6 |
|  28m 07s  | 2.61 | 3.6 |
|  28m 09s  | 2.62 | 3.6 |
|  28m 10s  | 2.74 | 3.6 |
|  28m 12s  | 2.58 | 3.6 |
|  28m 13s  | 2.6 | 3.6 |
|  28m 15s  | 2.58 | 3.6 |
|  28m 16s  | 2.63 | 3.6 |
|  28m 18s  | 2.56 | 3.6 |
|  28m 19s  | 2.54 | 3.6 |
|  28m 21s  | 2.6 | 3.6 |
|  28m 22s  | 2.6 | 3.6 |
|  28m 24s  | 2.61 | 3.6 |
|  28m 25s  | 2.56 | 3.6 |
|  28m 27s  | 2.51 | 3.6 |
|  28m 28s  | 2.54 | 3.6 |
|  28m 30s  | 2.45 | 3.6 |
|  28m 31s  | 2.41 | 3.6 |
|  28m 33s  | 2.51 | 3.6 |
|  28m 34s  | 2.43 | 3.6 |
|  28m 36s  | 2.41 | 3.6 |
|  28m 37s  | 2.39 | 3.6 |
|  28m 39s  | 2.43 | 3.6 |
|  28m 40s  | 2.4 | 3.6 |
|  28m 42s  | 2.37 | 3.6 |
|  28m 43s  | 2.33 | 3.6 |
|  28m 44s  | 2.33 | 3.6 |
|  28m 46s  | 2.3 | 3.6 |
|  28m 47s  | 2.36 | 3.6 |
|  28m 49s  | 2.29 | 3.6 |
|  28m 50s  | 2.27 | 3.6 |
|  28m 52s  | 2.28 | 3.6 |
|  28m 53s  | 2.25 | 3.6 |
|  28m 55s  | 2.23 | 3.6 |
|  28m 56s  | 2.22 | 3.6 |
|  28m 58s  | 2.24 | 3.6 |